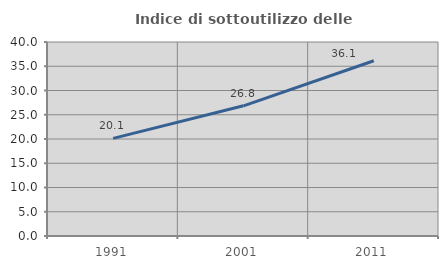
| Category | Indice di sottoutilizzo delle abitazioni  |
|---|---|
| 1991.0 | 20.128 |
| 2001.0 | 26.841 |
| 2011.0 | 36.141 |